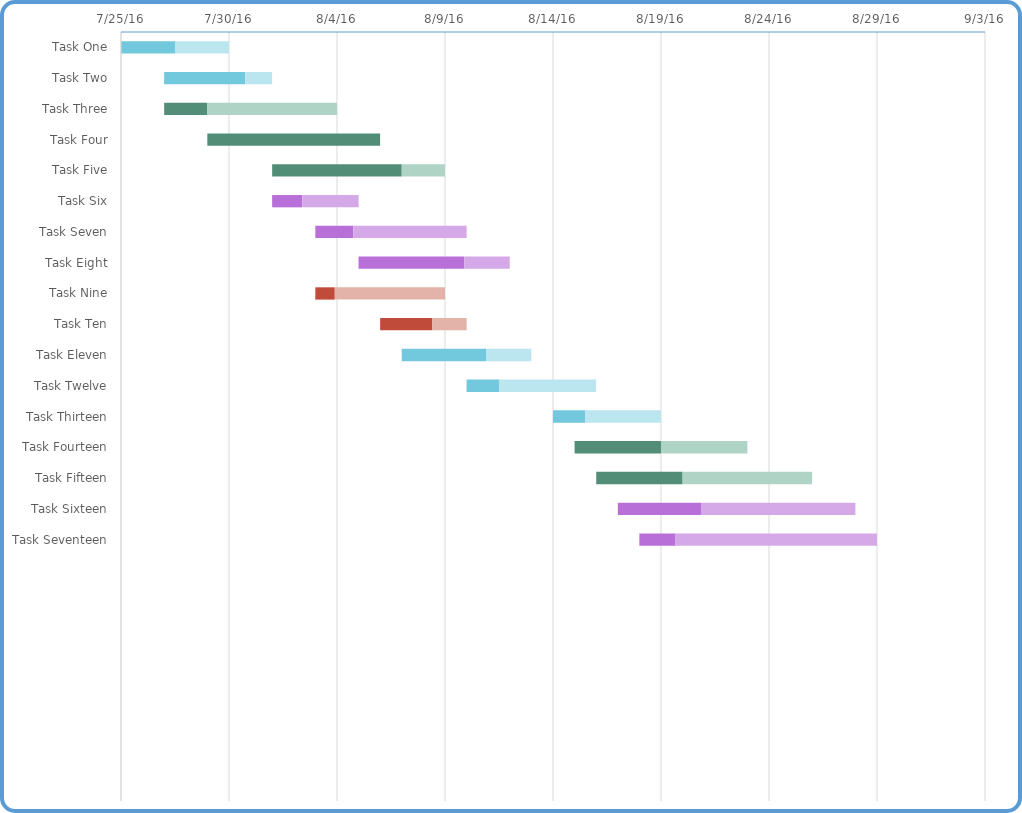
| Category | Start Date | Days Complete | Days Remain |
|---|---|---|---|
| Task One | 7/25/16 | 2.5 | 2.5 |
| Task Two | 7/27/16 | 3.75 | 1.25 |
| Task Three | 7/27/16 | 2 | 6 |
| Task Four | 7/29/16 | 8 | 0 |
| Task Five | 8/1/16 | 6 | 2 |
| Task Six | 8/1/16 | 1.4 | 2.6 |
| Task Seven | 8/3/16 | 1.75 | 5.25 |
| Task Eight | 8/5/16 | 4.9 | 2.1 |
| Task Nine | 8/3/16 | 0.9 | 5.1 |
| Task Ten | 8/6/16 | 2.4 | 1.6 |
| Task Eleven | 8/7/16 | 3.9 | 2.1 |
| Task Twelve | 8/10/16 | 1.5 | 4.5 |
| Task Thirteen | 8/14/16 | 1.5 | 3.5 |
| Task Fourteen | 8/15/16 | 4 | 4 |
| Task Fifteen | 8/16/16 | 4 | 6 |
| Task Sixteen | 8/17/16 | 3.85 | 7.15 |
| Task Seventeen | 8/18/16 | 1.65 | 9.35 |